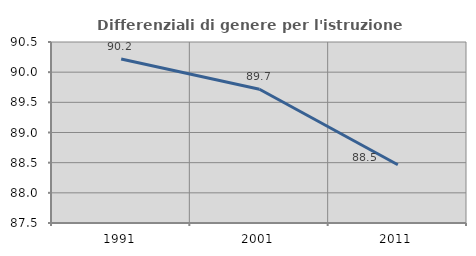
| Category | Differenziali di genere per l'istruzione superiore |
|---|---|
| 1991.0 | 90.22 |
| 2001.0 | 89.717 |
| 2011.0 | 88.465 |